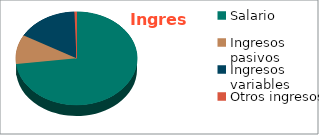
| Category | Series 0 |
|---|---|
| Salario | 54000000 |
| Ingresos pasivos | 7500000 |
| Ingresos variables | 12000000 |
| Otros ingresos | 400000 |